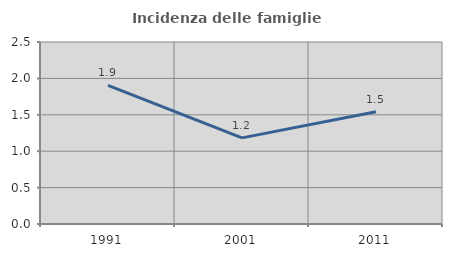
| Category | Incidenza delle famiglie numerose |
|---|---|
| 1991.0 | 1.905 |
| 2001.0 | 1.183 |
| 2011.0 | 1.541 |